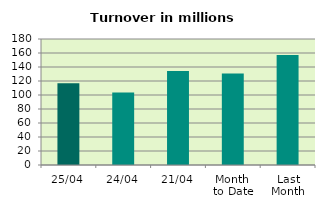
| Category | Series 0 |
|---|---|
| 25/04 | 116.849 |
| 24/04 | 103.592 |
| 21/04 | 134.424 |
| Month 
to Date | 130.798 |
| Last
Month | 157.238 |